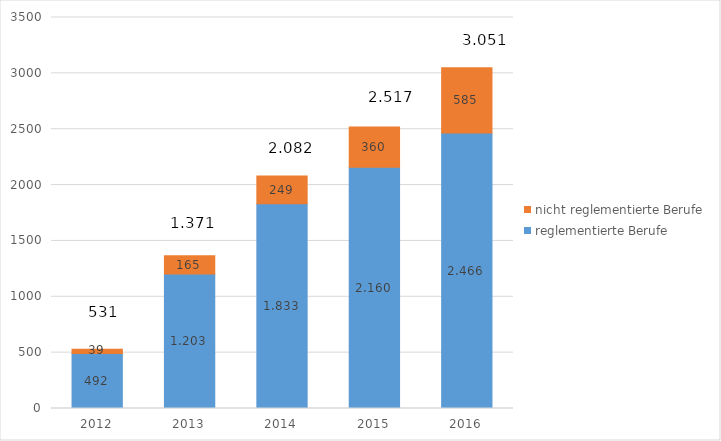
| Category | reglementierte Berufe | nicht reglementierte Berufe |
|---|---|---|
| 2012.0 | 492 | 39 |
| 2013.0 | 1203 | 165 |
| 2014.0 | 1833 | 249 |
| 2015.0 | 2160 | 360 |
| 2016.0 | 2466 | 585 |